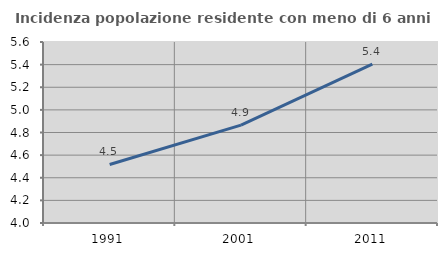
| Category | Incidenza popolazione residente con meno di 6 anni |
|---|---|
| 1991.0 | 4.517 |
| 2001.0 | 4.865 |
| 2011.0 | 5.404 |